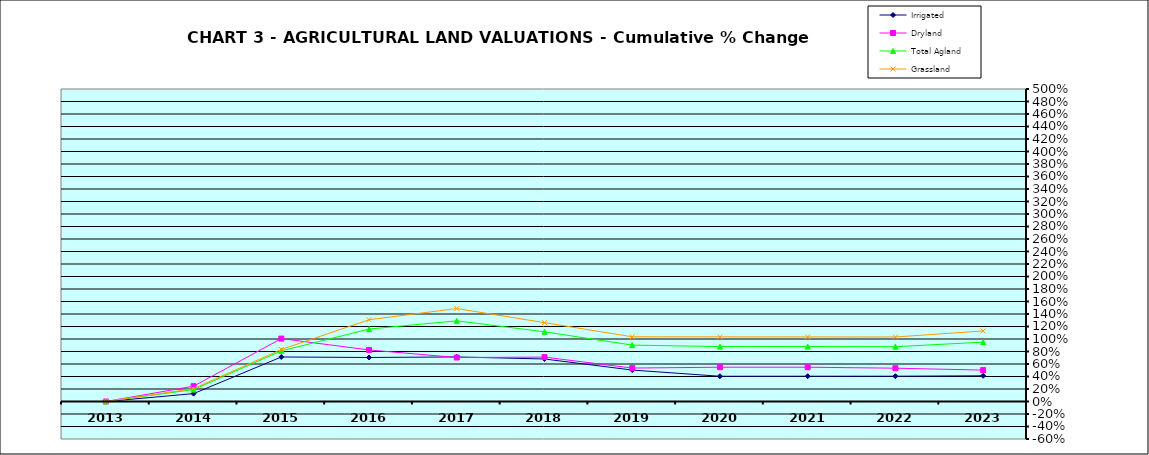
| Category | Irrigated | Dryland | Total Agland | Grassland |
|---|---|---|---|---|
| 2013.0 | 0 | 0 | 0 | 0 |
| 2014.0 | 0.126 | 0.245 | 0.191 | 0.206 |
| 2015.0 | 0.712 | 1.007 | 0.81 | 0.832 |
| 2016.0 | 0.704 | 0.825 | 1.159 | 1.308 |
| 2017.0 | 0.713 | 0.704 | 1.291 | 1.487 |
| 2018.0 | 0.68 | 0.71 | 1.115 | 1.261 |
| 2019.0 | 0.503 | 0.535 | 0.902 | 1.035 |
| 2020.0 | 0.404 | 0.549 | 0.879 | 1.034 |
| 2021.0 | 0.404 | 0.549 | 0.878 | 1.033 |
| 2022.0 | 0.405 | 0.533 | 0.877 | 1.032 |
| 2023.0 | 0.411 | 0.502 | 0.95 | 1.129 |